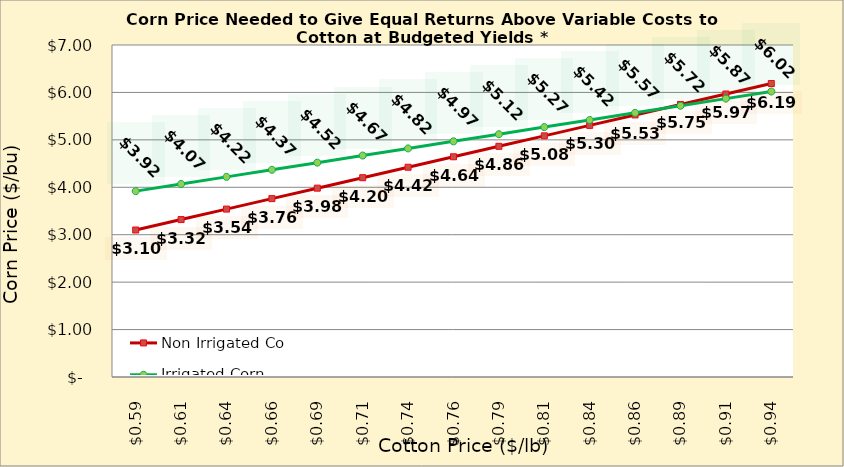
| Category | Non Irrigated Corn | Irrigated Corn |
|---|---|---|
| 0.5849999999999999 | 3.099 | 3.919 |
| 0.6099999999999999 | 3.32 | 4.069 |
| 0.6349999999999999 | 3.54 | 4.219 |
| 0.6599999999999999 | 3.761 | 4.369 |
| 0.6849999999999999 | 3.981 | 4.519 |
| 0.71 | 4.202 | 4.669 |
| 0.735 | 4.423 | 4.819 |
| 0.76 | 4.643 | 4.969 |
| 0.785 | 4.864 | 5.119 |
| 0.81 | 5.084 | 5.269 |
| 0.8350000000000001 | 5.305 | 5.419 |
| 0.8600000000000001 | 5.526 | 5.569 |
| 0.8850000000000001 | 5.746 | 5.719 |
| 0.9100000000000001 | 5.967 | 5.869 |
| 0.9350000000000002 | 6.187 | 6.019 |